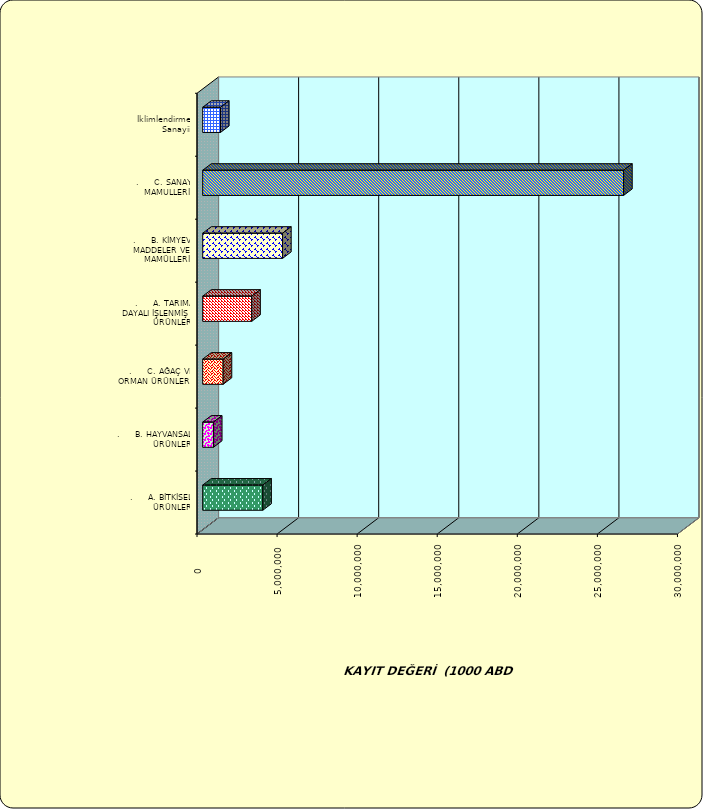
| Category | Series 0 |
|---|---|
| .     A. BİTKİSEL ÜRÜNLER | 3752485.783 |
| .     B. HAYVANSAL ÜRÜNLER | 670230.719 |
| .     C. AĞAÇ VE ORMAN ÜRÜNLERİ | 1277440.203 |
| .     A. TARIMA DAYALI İŞLENMİŞ ÜRÜNLER | 3062155.644 |
| .     B. KİMYEVİ MADDELER VE MAMÜLLERİ | 4988376.915 |
| .     C. SANAYİ MAMULLERİ | 26281950.279 |
|  İklimlendirme Sanayii | 1112357.566 |